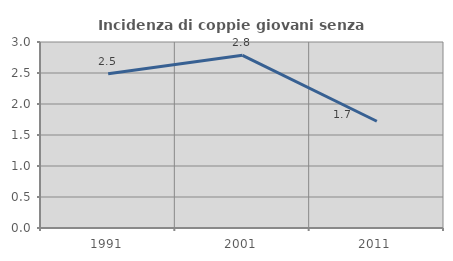
| Category | Incidenza di coppie giovani senza figli |
|---|---|
| 1991.0 | 2.49 |
| 2001.0 | 2.785 |
| 2011.0 | 1.722 |